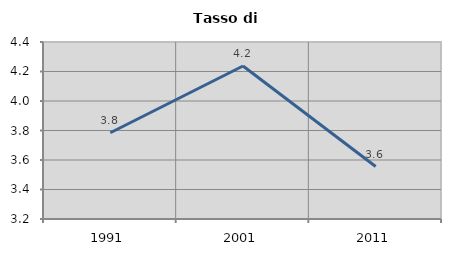
| Category | Tasso di disoccupazione   |
|---|---|
| 1991.0 | 3.785 |
| 2001.0 | 4.237 |
| 2011.0 | 3.556 |